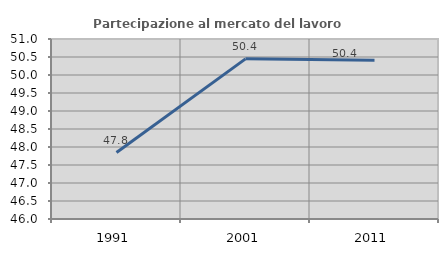
| Category | Partecipazione al mercato del lavoro  femminile |
|---|---|
| 1991.0 | 47.845 |
| 2001.0 | 50.448 |
| 2011.0 | 50.408 |